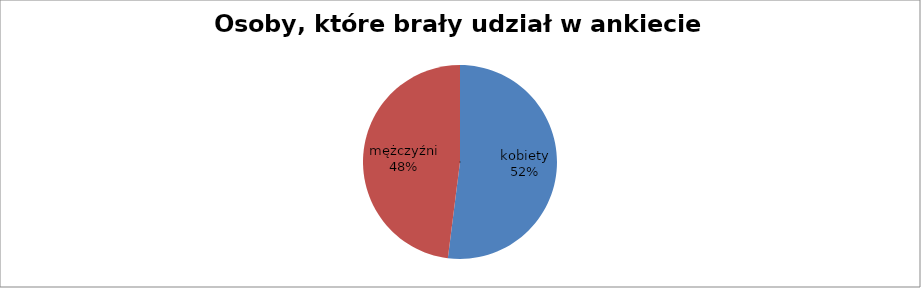
| Category | Osoby, które brały udział w ankiecie (dzieci) |
|---|---|
| kobiety | 52 |
| mężczyźni | 48 |